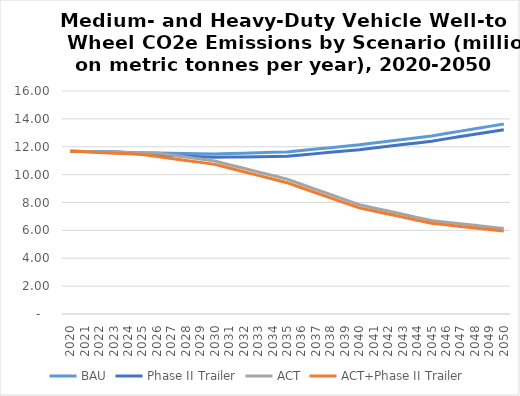
| Category | BAU | Phase II Trailer | ACT | ACT+Phase II Trailer |
|---|---|---|---|---|
| 2020.0 | 11.686 | 11.686 | 11.686 | 11.686 |
| 2021.0 | 11.663 | 11.663 | 11.663 | 11.637 |
| 2022.0 | 11.641 | 11.641 | 11.641 | 11.589 |
| 2023.0 | 11.618 | 11.618 | 11.618 | 11.541 |
| 2024.0 | 11.595 | 11.595 | 11.595 | 11.493 |
| 2025.0 | 11.573 | 11.457 | 11.56 | 11.444 |
| 2026.0 | 11.555 | 11.414 | 11.555 | 11.303 |
| 2027.0 | 11.537 | 11.37 | 11.409 | 11.161 |
| 2028.0 | 11.52 | 11.327 | 11.263 | 11.02 |
| 2029.0 | 11.502 | 11.283 | 11.117 | 10.878 |
| 2030.0 | 11.484 | 11.239 | 10.971 | 10.737 |
| 2031.0 | 11.513 | 11.256 | 10.712 | 10.474 |
| 2032.0 | 11.542 | 11.272 | 10.453 | 10.21 |
| 2033.0 | 11.57 | 11.288 | 10.194 | 9.947 |
| 2034.0 | 11.599 | 11.305 | 9.935 | 9.684 |
| 2035.0 | 11.628 | 11.321 | 9.676 | 9.421 |
| 2036.0 | 11.729 | 11.414 | 9.308 | 9.059 |
| 2037.0 | 11.831 | 11.507 | 8.941 | 8.698 |
| 2038.0 | 11.932 | 11.6 | 8.573 | 8.336 |
| 2039.0 | 12.034 | 11.693 | 8.205 | 7.975 |
| 2040.0 | 12.136 | 11.786 | 7.837 | 7.613 |
| 2041.0 | 12.264 | 11.909 | 7.611 | 7.393 |
| 2042.0 | 12.393 | 12.031 | 7.385 | 7.172 |
| 2043.0 | 12.522 | 12.154 | 7.159 | 6.952 |
| 2044.0 | 12.65 | 12.277 | 6.933 | 6.732 |
| 2045.0 | 12.779 | 12.399 | 6.708 | 6.511 |
| 2046.0 | 12.95 | 12.564 | 6.592 | 6.399 |
| 2047.0 | 13.121 | 12.73 | 6.477 | 6.286 |
| 2048.0 | 13.292 | 12.895 | 6.361 | 6.173 |
| 2049.0 | 13.463 | 13.06 | 6.246 | 6.061 |
| 2050.0 | 13.633 | 13.225 | 6.13 | 5.948 |